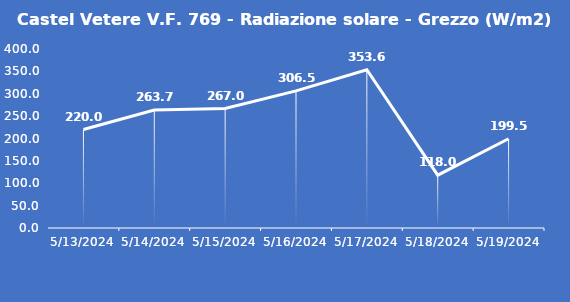
| Category | Castel Vetere V.F. 769 - Radiazione solare - Grezzo (W/m2) |
|---|---|
| 5/13/24 | 220 |
| 5/14/24 | 263.7 |
| 5/15/24 | 267 |
| 5/16/24 | 306.5 |
| 5/17/24 | 353.6 |
| 5/18/24 | 118 |
| 5/19/24 | 199.5 |